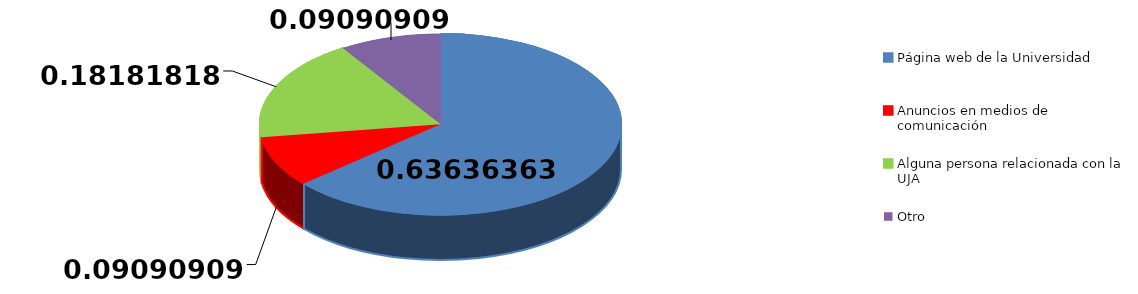
| Category | Frecuencia | Series 1 |
|---|---|---|
| Página web de la Universidad | 7 |  |
| Anuncios en medios de comunicación | 1 |  |
| Alguna persona relacionada con la UJA | 2 |  |
| Otro | 1 |  |